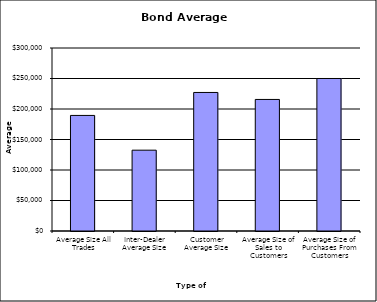
| Category | Security Type |
|---|---|
| Average Size All Trades | 189465.198 |
| Inter-Dealer Average Size | 132495.088 |
| Customer Average Size | 227119.162 |
| Average Size of Sales to Customers | 215672.66 |
| Average Size of Purchases From Customers | 250007.821 |